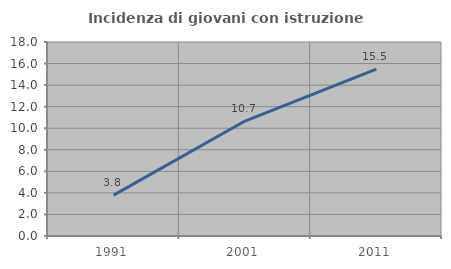
| Category | Incidenza di giovani con istruzione universitaria |
|---|---|
| 1991.0 | 3.797 |
| 2001.0 | 10.667 |
| 2011.0 | 15.493 |